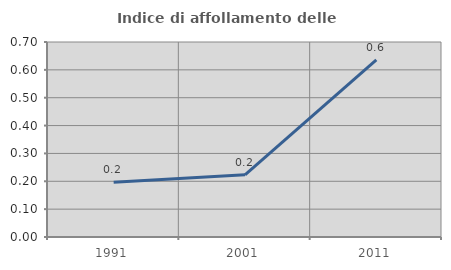
| Category | Indice di affollamento delle abitazioni  |
|---|---|
| 1991.0 | 0.197 |
| 2001.0 | 0.223 |
| 2011.0 | 0.636 |